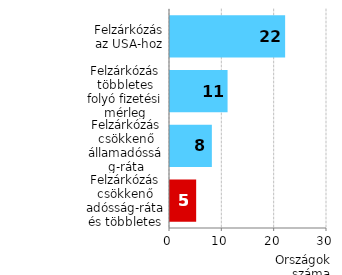
| Category | Országok száma |
|---|---|
| Felzárkózás csökkenő adósság-ráta és többletes folyó fizetési mérleg mellett | 5 |
| Felzárkózás csökkenő államadósság-ráta mellett | 8 |
| Felzárkózás többletes folyó fizetési mérleg mellett | 11 |
| Felzárkózás az USA-hoz | 22 |